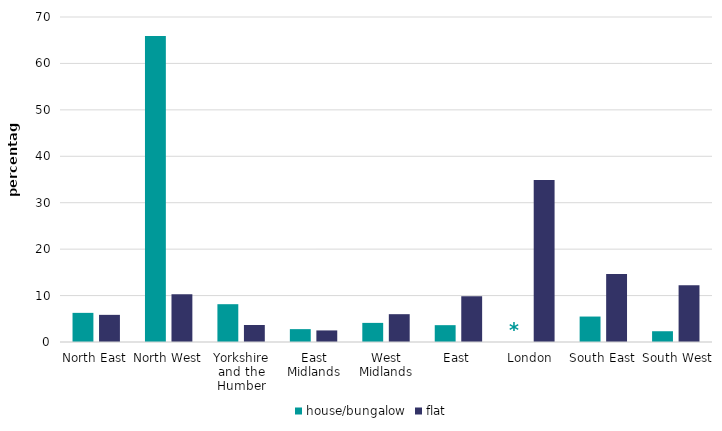
| Category | house/bungalow | flat |
|---|---|---|
| North East | 6.276 | 5.847 |
| North West | 65.926 | 10.297 |
| Yorkshire and the Humber | 8.143 | 3.664 |
| East Midlands | 2.771 | 2.493 |
| West Midlands | 4.116 | 5.993 |
| East | 3.627 | 9.875 |
| London | 0 | 34.915 |
| South East | 5.482 | 14.673 |
| South West | 2.319 | 12.243 |